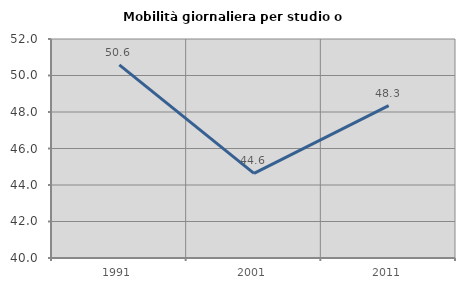
| Category | Mobilità giornaliera per studio o lavoro |
|---|---|
| 1991.0 | 50.581 |
| 2001.0 | 44.637 |
| 2011.0 | 48.347 |